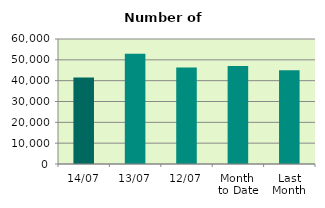
| Category | Series 0 |
|---|---|
| 14/07 | 41504 |
| 13/07 | 52966 |
| 12/07 | 46276 |
| Month 
to Date | 47049.4 |
| Last
Month | 45009.909 |